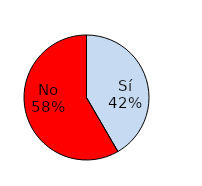
| Category | Series 1 |
|---|---|
| Sí | 72 |
| No | 101 |